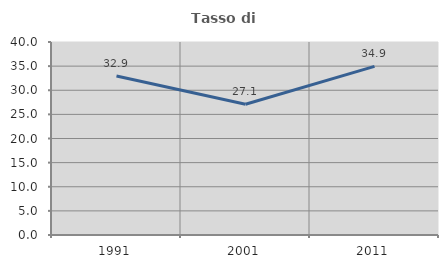
| Category | Tasso di occupazione   |
|---|---|
| 1991.0 | 32.943 |
| 2001.0 | 27.092 |
| 2011.0 | 34.948 |